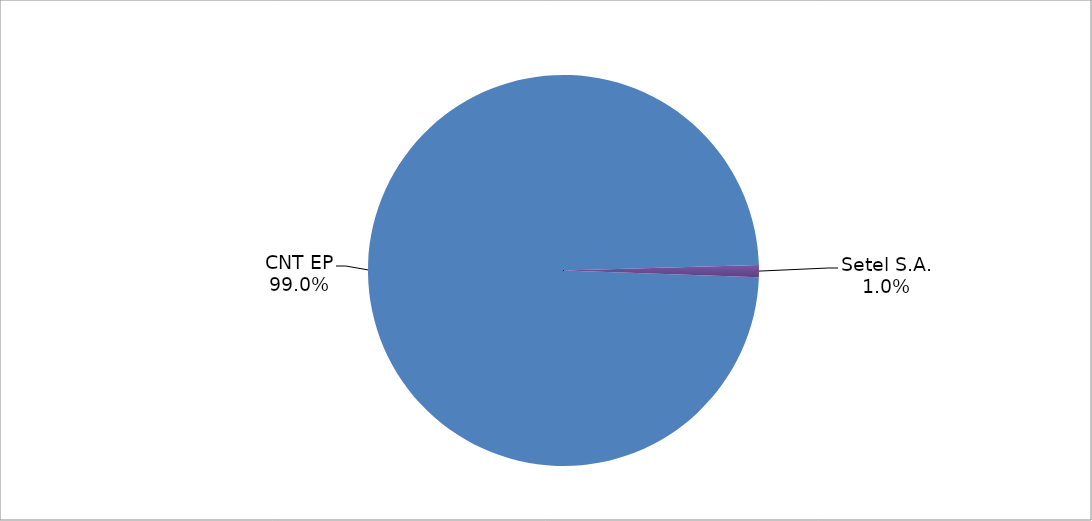
| Category | Series 0 |
|---|---|
| CNT EP | 293 |
| Setel S.A. | 3 |